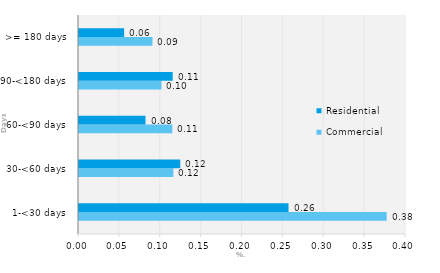
| Category | Commercial | Residential |
|---|---|---|
| 1-<30 days | 0.376 | 0.256 |
| 30-<60 days | 0.115 | 0.124 |
| 60-<90 days | 0.114 | 0.081 |
| 90-<180 days | 0.101 | 0.115 |
| >= 180 days | 0.09 | 0.055 |